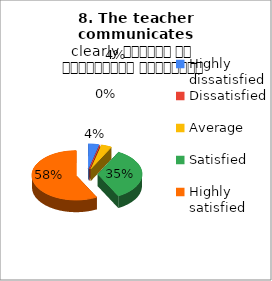
| Category | 8. The teacher communicates clearly शिक्षक का सम्प्रेषण सुस्पष्ट है |
|---|---|
| Highly dissatisfied | 1 |
| Dissatisfied | 0 |
| Average | 1 |
| Satisfied | 9 |
| Highly satisfied | 15 |